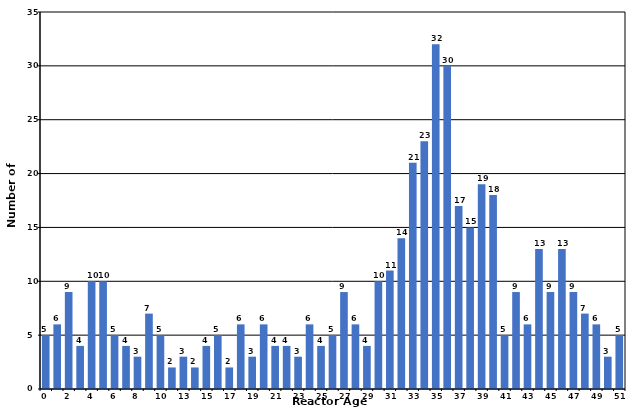
| Category | Age |
|---|---|
| 0.0 | 5 |
| 1.0 | 6 |
| 2.0 | 9 |
| 3.0 | 4 |
| 4.0 | 10 |
| 5.0 | 10 |
| 6.0 | 5 |
| 7.0 | 4 |
| 8.0 | 3 |
| 9.0 | 7 |
| 10.0 | 5 |
| 11.0 | 2 |
| 13.0 | 3 |
| 14.0 | 2 |
| 15.0 | 4 |
| 16.0 | 5 |
| 17.0 | 2 |
| 18.0 | 6 |
| 19.0 | 3 |
| 20.0 | 6 |
| 21.0 | 4 |
| 22.0 | 4 |
| 23.0 | 3 |
| 24.0 | 6 |
| 25.0 | 4 |
| 26.0 | 5 |
| 27.0 | 9 |
| 28.0 | 6 |
| 29.0 | 4 |
| 30.0 | 10 |
| 31.0 | 11 |
| 32.0 | 14 |
| 33.0 | 21 |
| 34.0 | 23 |
| 35.0 | 32 |
| 36.0 | 30 |
| 37.0 | 17 |
| 38.0 | 15 |
| 39.0 | 19 |
| 40.0 | 18 |
| 41.0 | 5 |
| 42.0 | 9 |
| 43.0 | 6 |
| 44.0 | 13 |
| 45.0 | 9 |
| 46.0 | 13 |
| 47.0 | 9 |
| 48.0 | 7 |
| 49.0 | 6 |
| 50.0 | 3 |
| 51.0 | 5 |